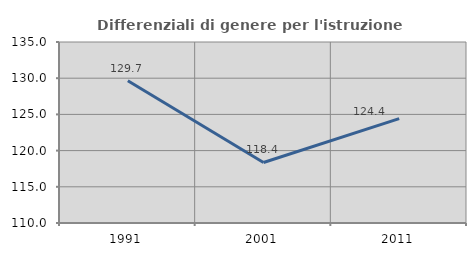
| Category | Differenziali di genere per l'istruzione superiore |
|---|---|
| 1991.0 | 129.651 |
| 2001.0 | 118.36 |
| 2011.0 | 124.414 |